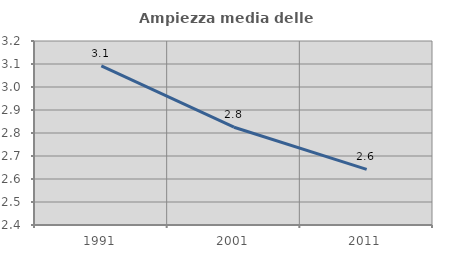
| Category | Ampiezza media delle famiglie |
|---|---|
| 1991.0 | 3.092 |
| 2001.0 | 2.825 |
| 2011.0 | 2.642 |